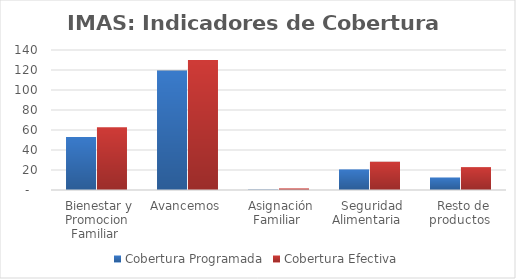
| Category | Cobertura Programada | Cobertura Efectiva |
|---|---|---|
| Bienestar y Promocion Familiar | 53.074 | 62.839 |
| Avancemos | 119.441 | 130.039 |
| Asignación Familiar | 0.426 | 1.594 |
| Seguridad Alimentaria | 20.621 | 28.289 |
| Resto de productos | 12.524 | 22.89 |